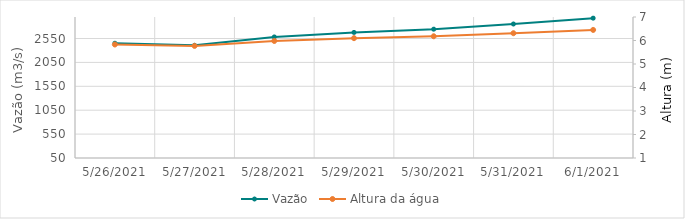
| Category | Vazão |
|---|---|
| 5/25/21 | 2614.85 |
| 5/24/21 | 2938.44 |
| 5/23/21 | 2790.3 |
| 5/22/21 | 2762.24 |
| 5/21/21 | 2690.13 |
| 5/20/21 | 2574.22 |
| 5/19/21 | 2421.98 |